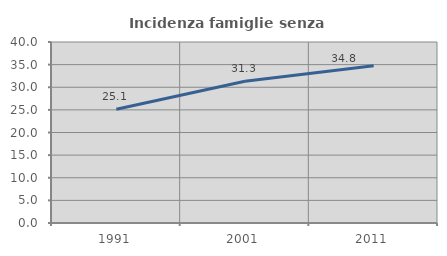
| Category | Incidenza famiglie senza nuclei |
|---|---|
| 1991.0 | 25.131 |
| 2001.0 | 31.34 |
| 2011.0 | 34.773 |